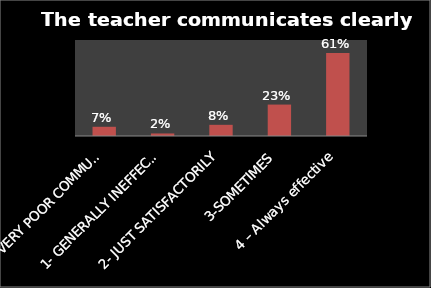
| Category | Series 0 |
|---|---|
| 0- VERY POOR COMMUNICATION | 0.067 |
| 1- GENERALLY INEFFECTIVE | 0.019 |
| 2- JUST SATISFACTORILY | 0.082 |
| 3-SOMETIMES | 0.229 |
| 4 – Always effective | 0.605 |